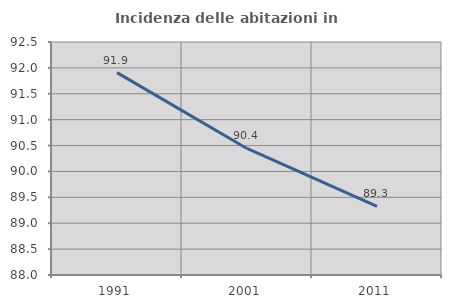
| Category | Incidenza delle abitazioni in proprietà  |
|---|---|
| 1991.0 | 91.909 |
| 2001.0 | 90.444 |
| 2011.0 | 89.326 |